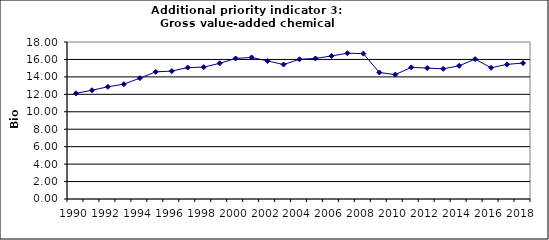
| Category | Gross value-added chemical industry, Bio Euro (EC95) |
|---|---|
| 1990 | 12.11 |
| 1991 | 12.471 |
| 1992 | 12.863 |
| 1993 | 13.163 |
| 1994 | 13.855 |
| 1995 | 14.578 |
| 1996 | 14.668 |
| 1997 | 15.074 |
| 1998 | 15.119 |
| 1999 | 15.555 |
| 2000 | 16.112 |
| 2001 | 16.232 |
| 2002 | 15.826 |
| 2003 | 15.42 |
| 2004 | 16.022 |
| 2005 | 16.112 |
| 2006 | 16.398 |
| 2007 | 16.714 |
| 2008 | 16.669 |
| 2009 | 14.502 |
| 2010 | 14.262 |
| 2011 | 15.089 |
| 2012 | 15.014 |
| 2013 | 14.924 |
| 2014 | 15.27 |
| 2015 | 16.037 |
| 2016 | 15.044 |
| 2017 | 15.435 |
| 2018 | 15.586 |